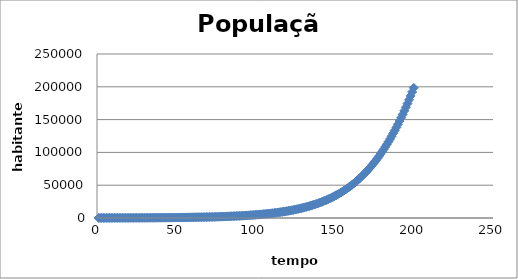
| Category | Series 0 |
|---|---|
| 1.0 | 100 |
| 2.0 | 104 |
| 3.0 | 108.159 |
| 4.0 | 112.485 |
| 5.0 | 116.984 |
| 6.0 | 121.663 |
| 7.0 | 126.529 |
| 8.0 | 131.589 |
| 9.0 | 136.852 |
| 10.0 | 142.325 |
| 11.0 | 148.018 |
| 12.0 | 153.937 |
| 13.0 | 160.094 |
| 14.0 | 166.497 |
| 15.0 | 173.155 |
| 16.0 | 180.08 |
| 17.0 | 187.282 |
| 18.0 | 194.772 |
| 19.0 | 202.562 |
| 20.0 | 210.662 |
| 21.0 | 219.087 |
| 22.0 | 227.849 |
| 23.0 | 236.961 |
| 24.0 | 246.437 |
| 25.0 | 256.292 |
| 26.0 | 266.541 |
| 27.0 | 277.2 |
| 28.0 | 288.285 |
| 29.0 | 299.813 |
| 30.0 | 311.802 |
| 31.0 | 324.27 |
| 32.0 | 337.236 |
| 33.0 | 350.721 |
| 34.0 | 364.745 |
| 35.0 | 379.33 |
| 36.0 | 394.497 |
| 37.0 | 410.271 |
| 38.0 | 426.675 |
| 39.0 | 443.735 |
| 40.0 | 461.476 |
| 41.0 | 479.927 |
| 42.0 | 499.115 |
| 43.0 | 519.069 |
| 44.0 | 539.821 |
| 45.0 | 561.402 |
| 46.0 | 583.846 |
| 47.0 | 607.186 |
| 48.0 | 631.459 |
| 49.0 | 656.701 |
| 50.0 | 682.952 |
| 51.0 | 710.251 |
| 52.0 | 738.641 |
| 53.0 | 768.165 |
| 54.0 | 798.868 |
| 55.0 | 830.797 |
| 56.0 | 864.001 |
| 57.0 | 898.532 |
| 58.0 | 934.441 |
| 59.0 | 971.783 |
| 60.0 | 1010.617 |
| 61.0 | 1051.001 |
| 62.0 | 1092.997 |
| 63.0 | 1136.669 |
| 64.0 | 1182.084 |
| 65.0 | 1229.311 |
| 66.0 | 1278.423 |
| 67.0 | 1329.495 |
| 68.0 | 1382.604 |
| 69.0 | 1437.831 |
| 70.0 | 1495.262 |
| 71.0 | 1554.983 |
| 72.0 | 1617.086 |
| 73.0 | 1681.664 |
| 74.0 | 1748.818 |
| 75.0 | 1818.648 |
| 76.0 | 1891.262 |
| 77.0 | 1966.769 |
| 78.0 | 2045.285 |
| 79.0 | 2126.93 |
| 80.0 | 2211.826 |
| 81.0 | 2300.103 |
| 82.0 | 2391.896 |
| 83.0 | 2487.343 |
| 84.0 | 2586.589 |
| 85.0 | 2689.785 |
| 86.0 | 2797.087 |
| 87.0 | 2908.657 |
| 88.0 | 3024.665 |
| 89.0 | 3145.286 |
| 90.0 | 3270.701 |
| 91.0 | 3401.102 |
| 92.0 | 3536.683 |
| 93.0 | 3677.65 |
| 94.0 | 3824.215 |
| 95.0 | 3976.599 |
| 96.0 | 4135.03 |
| 97.0 | 4299.747 |
| 98.0 | 4470.998 |
| 99.0 | 4649.038 |
| 100.0 | 4834.135 |
| 101.0 | 5026.566 |
| 102.0 | 5226.618 |
| 103.0 | 5434.59 |
| 104.0 | 5650.792 |
| 105.0 | 5875.546 |
| 106.0 | 6109.187 |
| 107.0 | 6352.062 |
| 108.0 | 6604.53 |
| 109.0 | 6866.967 |
| 110.0 | 7139.759 |
| 111.0 | 7423.31 |
| 112.0 | 7718.039 |
| 113.0 | 8024.377 |
| 114.0 | 8342.777 |
| 115.0 | 8673.704 |
| 116.0 | 9017.643 |
| 117.0 | 9375.096 |
| 118.0 | 9746.584 |
| 119.0 | 10132.647 |
| 120.0 | 10533.846 |
| 121.0 | 10950.762 |
| 122.0 | 11383.996 |
| 123.0 | 11834.172 |
| 124.0 | 12301.937 |
| 125.0 | 12787.961 |
| 126.0 | 13292.938 |
| 127.0 | 13817.587 |
| 128.0 | 14362.654 |
| 129.0 | 14928.908 |
| 130.0 | 15517.15 |
| 131.0 | 16128.204 |
| 132.0 | 16762.928 |
| 133.0 | 17422.205 |
| 134.0 | 18106.952 |
| 135.0 | 18818.116 |
| 136.0 | 19556.675 |
| 137.0 | 20323.644 |
| 138.0 | 21120.068 |
| 139.0 | 21947.028 |
| 140.0 | 22805.642 |
| 141.0 | 23697.064 |
| 142.0 | 24622.484 |
| 143.0 | 25583.133 |
| 144.0 | 26580.279 |
| 145.0 | 27615.229 |
| 146.0 | 28689.334 |
| 147.0 | 29803.985 |
| 148.0 | 30960.613 |
| 149.0 | 32160.695 |
| 150.0 | 33405.751 |
| 151.0 | 34697.343 |
| 152.0 | 36037.08 |
| 153.0 | 37426.617 |
| 154.0 | 38867.651 |
| 155.0 | 40361.93 |
| 156.0 | 41911.243 |
| 157.0 | 43517.431 |
| 158.0 | 45182.378 |
| 159.0 | 46908.015 |
| 160.0 | 48696.321 |
| 161.0 | 50549.32 |
| 162.0 | 52469.084 |
| 163.0 | 54457.727 |
| 164.0 | 56517.41 |
| 165.0 | 58650.338 |
| 166.0 | 60858.757 |
| 167.0 | 63144.956 |
| 168.0 | 65511.263 |
| 169.0 | 67960.044 |
| 170.0 | 70493.703 |
| 171.0 | 73114.677 |
| 172.0 | 75825.434 |
| 173.0 | 78628.471 |
| 174.0 | 81526.313 |
| 175.0 | 84521.504 |
| 176.0 | 87616.608 |
| 177.0 | 90814.206 |
| 178.0 | 94116.885 |
| 179.0 | 97527.241 |
| 180.0 | 101047.868 |
| 181.0 | 104681.356 |
| 182.0 | 108430.283 |
| 183.0 | 112297.209 |
| 184.0 | 116284.671 |
| 185.0 | 120395.173 |
| 186.0 | 124631.18 |
| 187.0 | 128995.11 |
| 188.0 | 133489.325 |
| 189.0 | 138116.122 |
| 190.0 | 142877.724 |
| 191.0 | 147776.271 |
| 192.0 | 152813.809 |
| 193.0 | 157992.279 |
| 194.0 | 163313.508 |
| 195.0 | 168779.196 |
| 196.0 | 174390.907 |
| 197.0 | 180150.056 |
| 198.0 | 186057.896 |
| 199.0 | 192115.511 |
| 200.0 | 198323.796 |